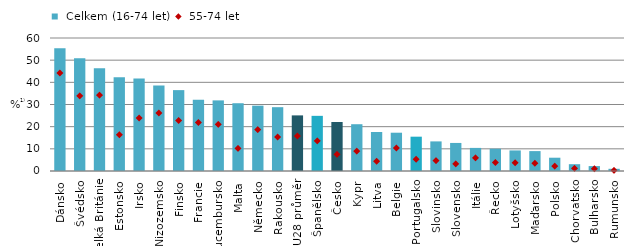
| Category |  Celkem (16-74 let) |
|---|---|
| Dánsko | 55.365 |
| Švédsko | 50.846 |
| Velká Británie | 46.355 |
| Estonsko | 42.258 |
| Irsko | 41.686 |
| Nizozemsko | 38.62 |
| Finsko | 36.487 |
| Francie | 32.13 |
| Lucembursko | 31.857 |
| Malta | 30.573 |
| Německo | 29.472 |
| Rakousko | 28.791 |
| EU28 průměr | 25.087 |
| Španělsko | 24.884 |
| Česko | 22.102 |
| Kypr | 21.104 |
| Litva | 17.602 |
| Belgie | 17.272 |
| Portugalsko | 15.483 |
| Slovinsko | 13.354 |
| Slovensko | 12.657 |
| Itálie | 10.42 |
| Řecko | 10.044 |
| Lotyšsko | 9.276 |
| Maďarsko | 8.978 |
| Polsko | 5.995 |
| Chorvatsko | 3.07 |
| Bulharsko | 2.217 |
| Rumunsko | 0.991 |